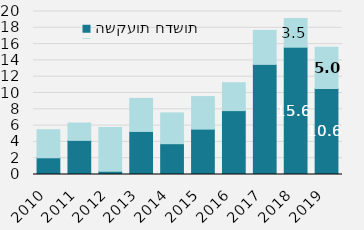
| Category | השקעות חדשות | רווחים צבורים |
|---|---|---|
| 0 | 2053 | 3440 |
| 1 | 4187 | 2127 |
| 2 | 386 | 5381 |
| 3 | 5283 | 4057 |
| 4 | 3779 | 3777 |
| 5 | 5569 | 3992 |
| 6 | 7839 | 3424 |
| 7 | 13511 | 4170 |
| 8 | 15618 | 3516 |
| 9 | 10566 | 5046 |